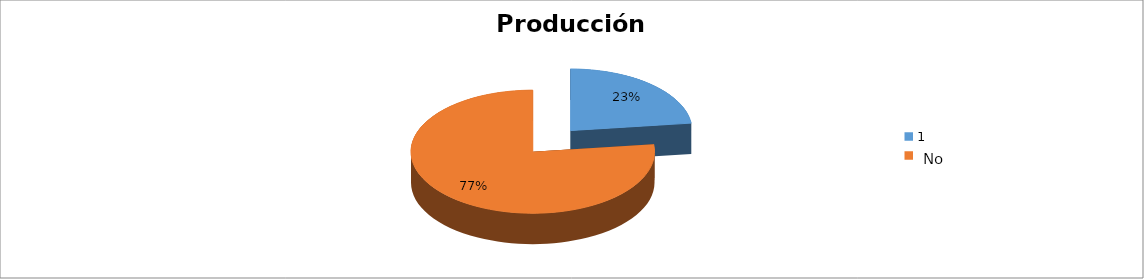
| Category | Series 0 |
|---|---|
| 0 | 0.231 |
| 1 | 0.769 |